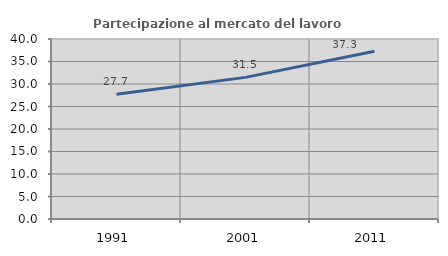
| Category | Partecipazione al mercato del lavoro  femminile |
|---|---|
| 1991.0 | 27.701 |
| 2001.0 | 31.473 |
| 2011.0 | 37.278 |